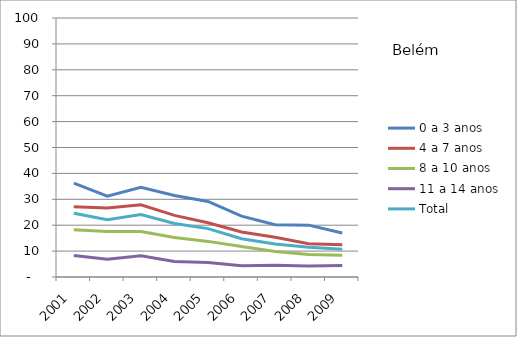
| Category | 0 a 3 anos | 4 a 7 anos | 8 a 10 anos | 11 a 14 anos | Total |
|---|---|---|---|---|---|
| 2001.0 | 36.26 | 27.13 | 18.21 | 8.28 | 24.58 |
| 2002.0 | 31.19 | 26.64 | 17.6 | 6.84 | 22.14 |
| 2003.0 | 34.67 | 27.91 | 17.57 | 8.16 | 24.08 |
| 2004.0 | 31.45 | 23.78 | 15.25 | 6.03 | 20.65 |
| 2005.0 | 29.17 | 20.94 | 13.75 | 5.56 | 18.68 |
| 2006.0 | 23.52 | 17.35 | 11.78 | 4.36 | 14.78 |
| 2007.0 | 20.15 | 15.31 | 9.85 | 4.53 | 12.74 |
| 2008.0 | 20.02 | 12.81 | 8.72 | 4.29 | 11.53 |
| 2009.0 | 16.97 | 12.47 | 8.42 | 4.41 | 10.7 |